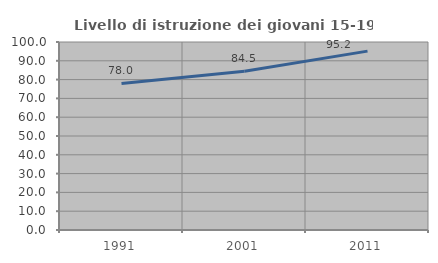
| Category | Livello di istruzione dei giovani 15-19 anni |
|---|---|
| 1991.0 | 77.951 |
| 2001.0 | 84.497 |
| 2011.0 | 95.156 |